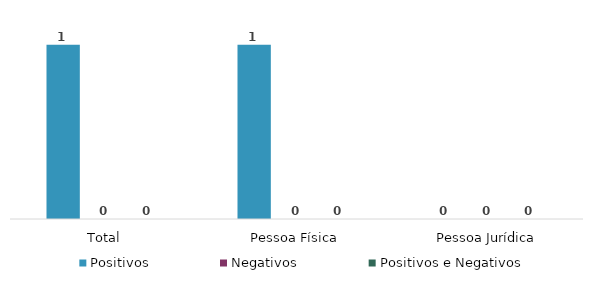
| Category | Positivos | Negativos | Positivos e Negativos |
|---|---|---|---|
| Total | 1 | 0 | 0 |
| Pessoa Física | 1 | 0 | 0 |
| Pessoa Jurídica | 0 | 0 | 0 |